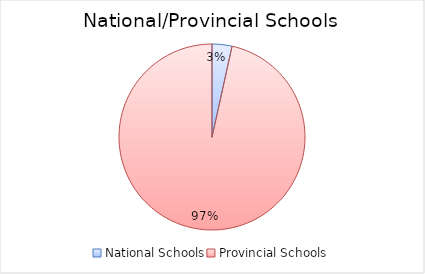
| Category | Series 0 |
|---|---|
| National Schools | 353 |
| Provincial Schools | 9841 |